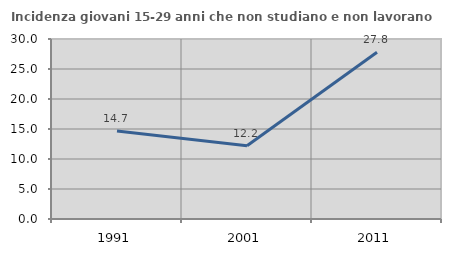
| Category | Incidenza giovani 15-29 anni che non studiano e non lavorano  |
|---|---|
| 1991.0 | 14.685 |
| 2001.0 | 12.195 |
| 2011.0 | 27.778 |